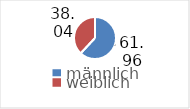
| Category | Series 0 |
|---|---|
| männlich | 61.955 |
| weiblich | 38.045 |